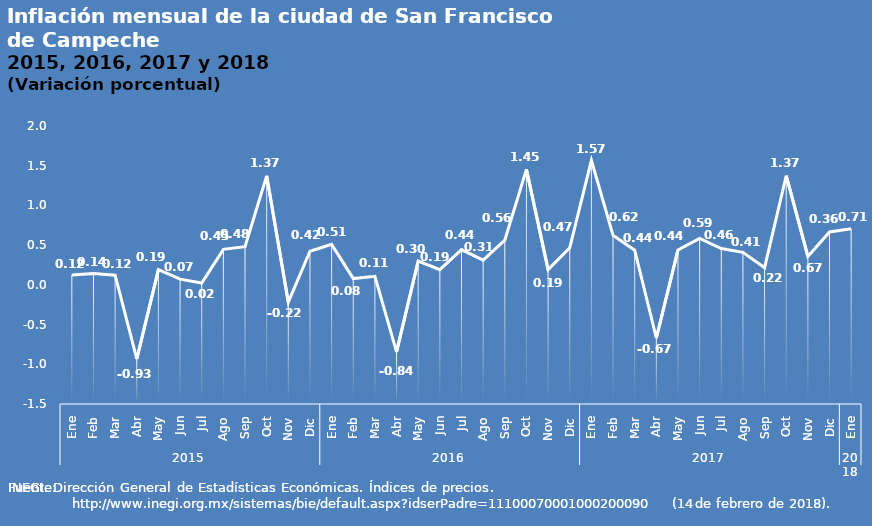
| Category | Inflación |
|---|---|
| 0 | 0.124 |
| 1 | 0.144 |
| 2 | 0.122 |
| 3 | -0.933 |
| 4 | 0.193 |
| 5 | 0.072 |
| 6 | 0.022 |
| 7 | 0.447 |
| 8 | 0.48 |
| 9 | 1.373 |
| 10 | -0.218 |
| 11 | 0.423 |
| 12 | 0.509 |
| 13 | 0.079 |
| 14 | 0.107 |
| 15 | -0.843 |
| 16 | 0.3 |
| 17 | 0.191 |
| 18 | 0.444 |
| 19 | 0.31 |
| 20 | 0.563 |
| 21 | 1.455 |
| 22 | 0.192 |
| 23 | 0.467 |
| 24 | 1.568 |
| 25 | 0.623 |
| 26 | 0.437 |
| 27 | -0.669 |
| 28 | 0.44 |
| 29 | 0.585 |
| 30 | 0.458 |
| 31 | 0.409 |
| 32 | 0.217 |
| 33 | 1.374 |
| 34 | 0.357 |
| 35 | 0.667 |
| 36 | 0.707 |